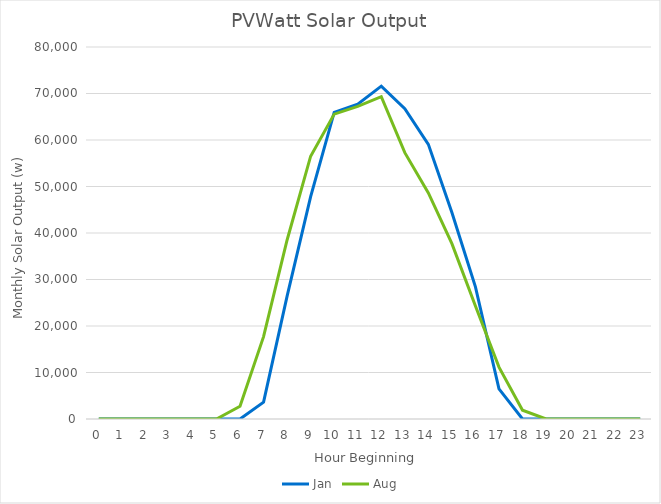
| Category | Jan | Aug |
|---|---|---|
| 0.0 | 0 | 0 |
| 1.0 | 0 | 0 |
| 2.0 | 0 | 0 |
| 3.0 | 0 | 0 |
| 4.0 | 0 | 0 |
| 5.0 | 0 | 0 |
| 6.0 | 0 | 2728.321 |
| 7.0 | 3632.543 | 17715.89 |
| 8.0 | 26422.35 | 38497.021 |
| 9.0 | 47833.298 | 56513.556 |
| 10.0 | 65933.257 | 65562.786 |
| 11.0 | 67713.985 | 67220.432 |
| 12.0 | 71587.249 | 69321.463 |
| 13.0 | 66727.165 | 57278.402 |
| 14.0 | 59058.269 | 48606.05 |
| 15.0 | 44390.895 | 37712.954 |
| 16.0 | 28409.253 | 24289.55 |
| 17.0 | 6461.525 | 11151.625 |
| 18.0 | 0 | 1891.84 |
| 19.0 | 0 | 0 |
| 20.0 | 0 | 0 |
| 21.0 | 0 | 0 |
| 22.0 | 0 | 0 |
| 23.0 | 0 | 0 |